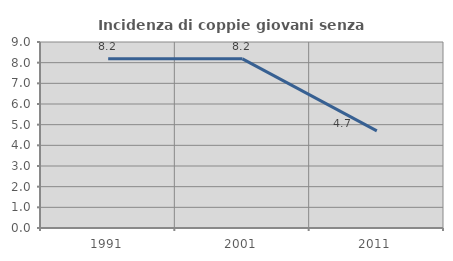
| Category | Incidenza di coppie giovani senza figli |
|---|---|
| 1991.0 | 8.194 |
| 2001.0 | 8.185 |
| 2011.0 | 4.698 |